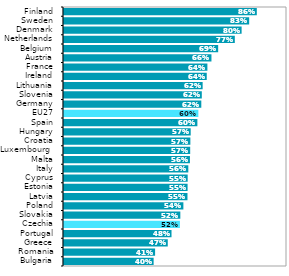
| Category | Series 1 |
|---|---|
| Bulgaria | 0.402 |
| Romania | 0.409 |
| Greece | 0.465 |
| Portugal | 0.482 |
| Czechia | 0.52 |
| Slovakia | 0.522 |
| Poland | 0.535 |
| Latvia | 0.554 |
| Estonia | 0.554 |
| Cyprus | 0.555 |
| Italy | 0.557 |
| Malta | 0.565 |
| Luxembourg  | 0.566 |
| Croatia | 0.567 |
| Hungary | 0.568 |
| Spain | 0.598 |
| EU27 | 0.602 |
| Germany | 0.616 |
| Slovenia | 0.618 |
| Lithuania | 0.622 |
| Ireland | 0.64 |
| France | 0.643 |
| Austria | 0.661 |
| Belgium | 0.691 |
| Netherlands | 0.766 |
| Denmark | 0.796 |
| Sweden | 0.83 |
| Finland | 0.865 |